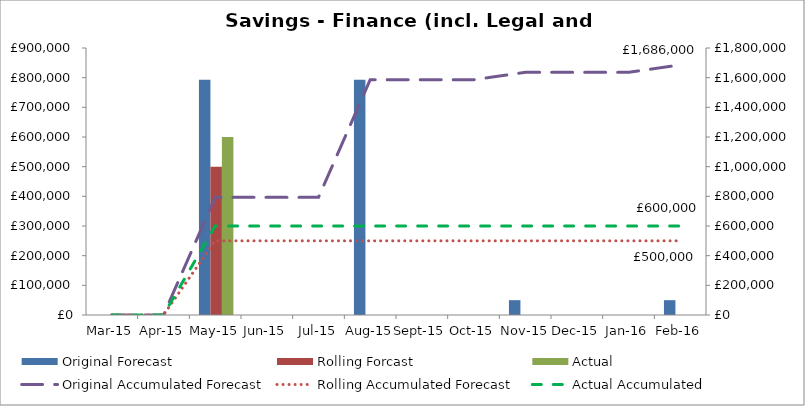
| Category | Original Forecast | Rolling Forcast | Actual |
|---|---|---|---|
| 2015-03-01 | 0 | 0 | 0 |
| 2015-04-01 | 0 | 0 | 0 |
| 2015-05-01 | 793000 | 500000 | 600000 |
| 2015-06-01 | 0 | 0 | 0 |
| 2015-07-01 | 0 | 0 | 0 |
| 2015-08-01 | 793000 | 0 | 0 |
| 2015-09-01 | 0 | 0 | 0 |
| 2015-10-01 | 0 | 0 | 0 |
| 2015-11-01 | 50000 | 0 | 0 |
| 2015-12-01 | 0 | 0 | 0 |
| 2016-01-01 | 0 | 0 | 0 |
| 2016-02-01 | 50000 | 0 | 0 |